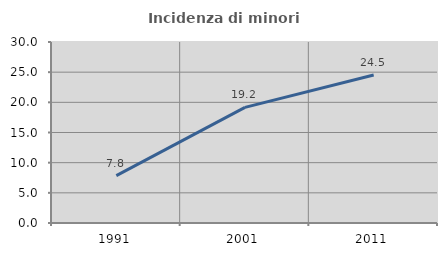
| Category | Incidenza di minori stranieri |
|---|---|
| 1991.0 | 7.843 |
| 2001.0 | 19.164 |
| 2011.0 | 24.522 |